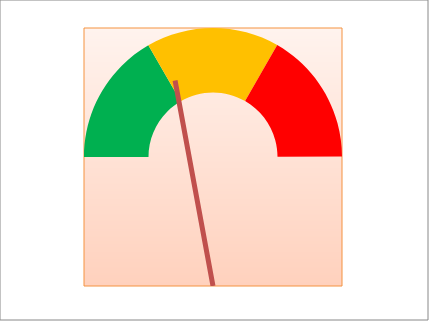
| Category | Series 0 |
|---|---|
| 0 | 1.33 |
| 1 | 1.33 |
| 2 | 0 |
| 3 | 1.33 |
| 4 | 4 |